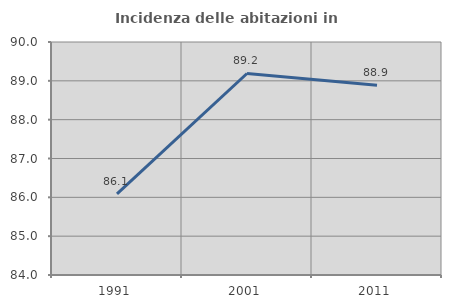
| Category | Incidenza delle abitazioni in proprietà  |
|---|---|
| 1991.0 | 86.087 |
| 2001.0 | 89.189 |
| 2011.0 | 88.889 |